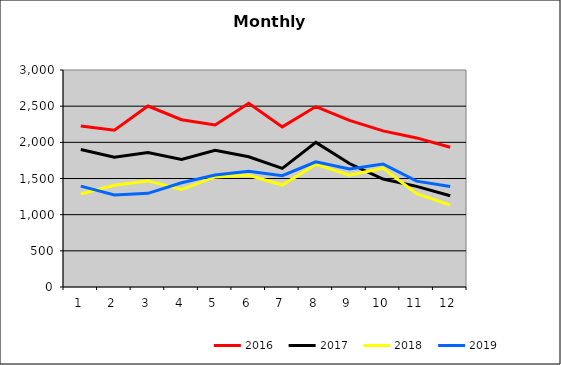
| Category | 2016 | 2017 | 2018 | 2019 |
|---|---|---|---|---|
| 0 | 2226.188 | 1900.859 | 1286.21 | 1394.576 |
| 1 | 2166.497 | 1795.105 | 1406.556 | 1272.617 |
| 2 | 2501.903 | 1859.386 | 1466.695 | 1295.231 |
| 3 | 2312.349 | 1764.013 | 1347.408 | 1441.267 |
| 4 | 2240.561 | 1891.399 | 1522.181 | 1548.691 |
| 5 | 2540.235 | 1800.236 | 1543.945 | 1598.892 |
| 6 | 2213.485 | 1640.121 | 1409.491 | 1538.112 |
| 7 | 2494.361 | 1999.331 | 1694.901 | 1729.426 |
| 8 | 2304.009 | 1706.874 | 1545.104 | 1631.933 |
| 9 | 2158.544 | 1492.036 | 1642.816 | 1701.214 |
| 10 | 2060.966 | 1390.86 | 1288.934 | 1463.951 |
| 11 | 1932.97 | 1261.902 | 1131.485 | 1390.399 |